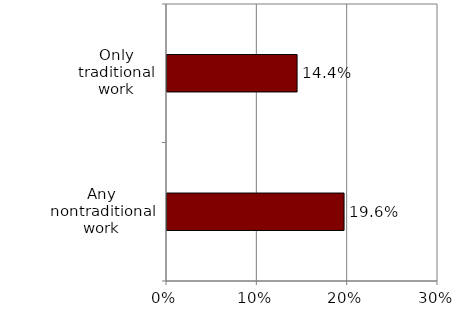
| Category | Series 0 |
|---|---|
| Any nontraditional work | 0.196 |
| Only traditional work | 0.144 |